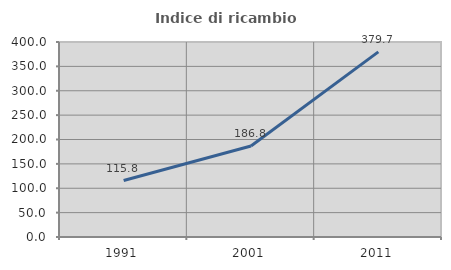
| Category | Indice di ricambio occupazionale  |
|---|---|
| 1991.0 | 115.817 |
| 2001.0 | 186.801 |
| 2011.0 | 379.695 |